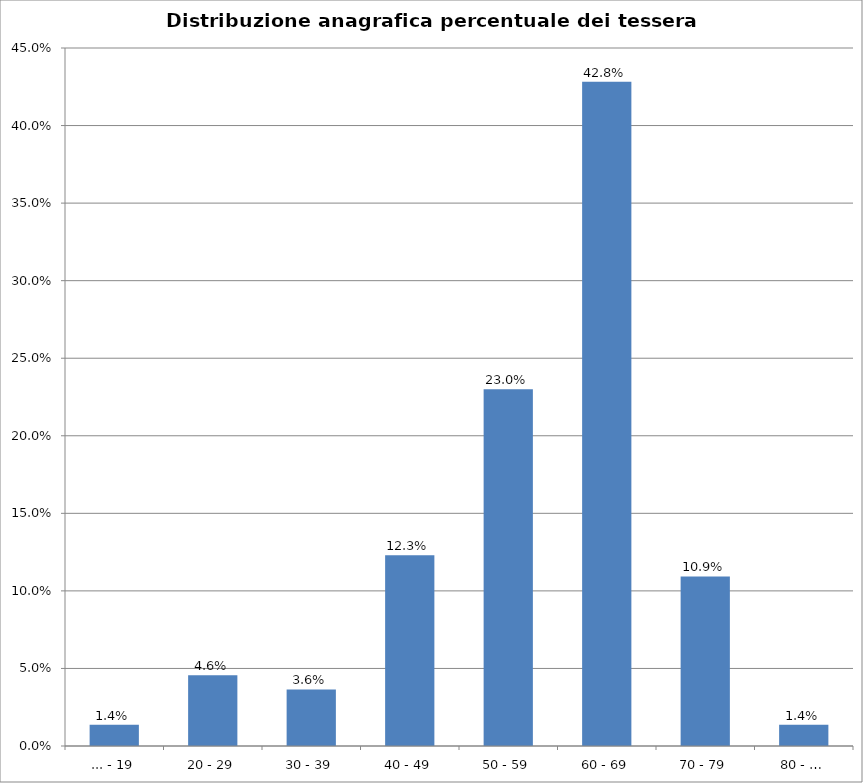
| Category | % Tesserati |
|---|---|
| ... - 19 | 0.014 |
| 20 - 29 | 0.046 |
| 30 - 39 | 0.036 |
| 40 - 49 | 0.123 |
| 50 - 59 | 0.23 |
| 60 - 69 | 0.428 |
| 70 - 79 | 0.109 |
| 80 - … | 0.014 |